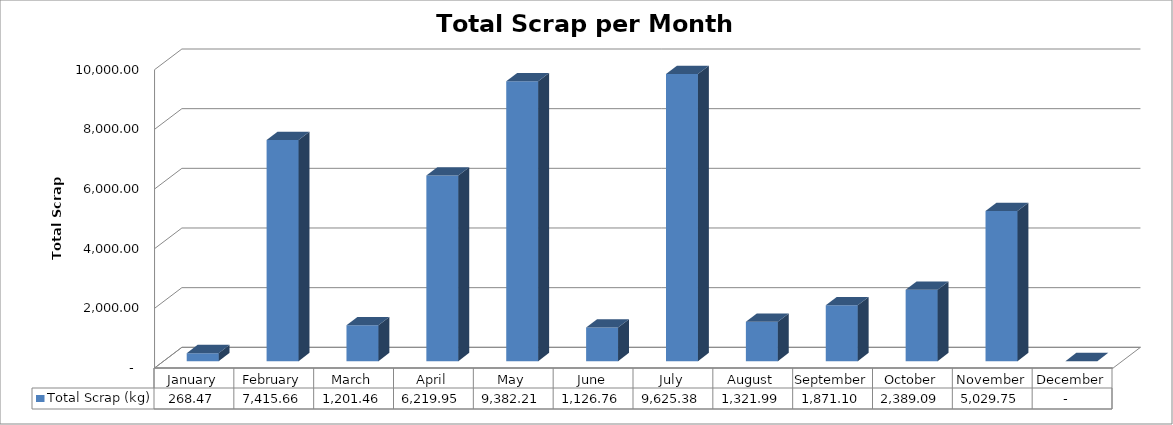
| Category | Total Scrap (kg) |
|---|---|
| January | 268.471 |
| February | 7415.656 |
| March | 1201.463 |
| April | 6219.951 |
| May | 9382.21 |
| June | 1126.759 |
| July | 9625.377 |
| August | 1321.987 |
| September | 1871.097 |
| October | 2389.087 |
| November | 5029.749 |
| December | 0 |